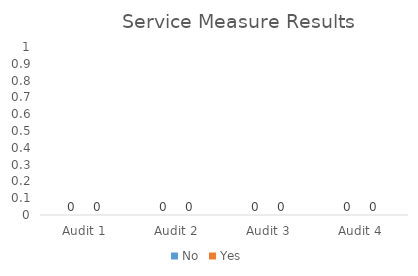
| Category | No | Yes |
|---|---|---|
| Audit 1 | 0 | 0 |
| Audit 2 | 0 | 0 |
| Audit 3 | 0 | 0 |
| Audit 4 | 0 | 0 |